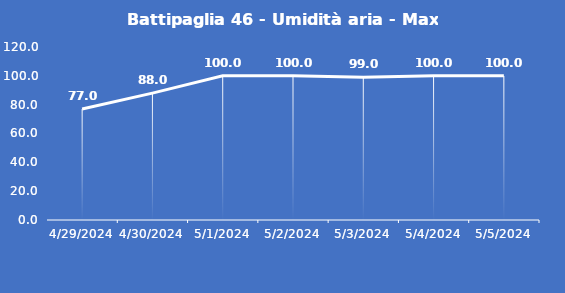
| Category | Battipaglia 46 - Umidità aria - Max (%) |
|---|---|
| 4/29/24 | 77 |
| 4/30/24 | 88 |
| 5/1/24 | 100 |
| 5/2/24 | 100 |
| 5/3/24 | 99 |
| 5/4/24 | 100 |
| 5/5/24 | 100 |